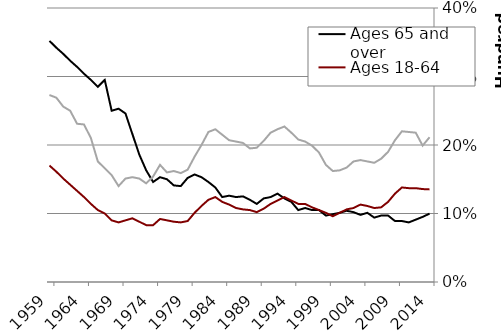
| Category | Ages 65 and over | Ages 18-64 |
|---|---|---|
| 2014.0 | 9.98 | 13.52 |
| 2013.0 | 9.506 | 13.565 |
| 2012.0 | 9.1 | 13.7 |
| 2011.0 | 8.7 | 13.7 |
| 2010.0 | 8.9 | 13.8 |
| 2009.0 | 8.9 | 12.9 |
| 2008.0 | 9.7 | 11.7 |
| 2007.0 | 9.7 | 10.9 |
| 2006.0 | 9.4 | 10.8 |
| 2005.0 | 10.1 | 11.1 |
| 2004.0 | 9.8 | 11.3 |
| 2003.0 | 10.2 | 10.8 |
| 2002.0 | 10.4 | 10.6 |
| 2001.0 | 10.1 | 10.1 |
| 2000.0 | 9.9 | 9.6 |
| 1999.0 | 9.7 | 10.1 |
| 1998.0 | 10.5 | 10.5 |
| 1997.0 | 10.5 | 10.9 |
| 1996.0 | 10.8 | 11.4 |
| 1995.0 | 10.5 | 11.4 |
| 1994.0 | 11.7 | 11.9 |
| 1993.0 | 12.2 | 12.4 |
| 1992.0 | 12.9 | 11.9 |
| 1991.0 | 12.4 | 11.4 |
| 1990.0 | 12.2 | 10.7 |
| 1989.0 | 11.4 | 10.2 |
| 1988.0 | 12 | 10.5 |
| 1987.0 | 12.5 | 10.6 |
| 1986.0 | 12.4 | 10.8 |
| 1985.0 | 12.6 | 11.3 |
| 1984.0 | 12.4 | 11.7 |
| 1983.0 | 13.8 | 12.4 |
| 1982.0 | 14.6 | 12 |
| 1981.0 | 15.3 | 11.1 |
| 1980.0 | 15.7 | 10.1 |
| 1979.0 | 15.2 | 8.9 |
| 1978.0 | 14 | 8.7 |
| 1977.0 | 14.1 | 8.8 |
| 1976.0 | 15 | 9 |
| 1975.0 | 15.3 | 9.2 |
| 1974.0 | 14.6 | 8.3 |
| 1973.0 | 16.3 | 8.3 |
| 1972.0 | 18.6 | 8.8 |
| 1971.0 | 21.6 | 9.3 |
| 1970.0 | 24.6 | 9 |
| 1969.0 | 25.3 | 8.7 |
| 1968.0 | 25 | 9 |
| 1967.0 | 29.5 | 10 |
| 1966.0 | 28.5 | 10.5 |
| 1965.0 | 29.5 | 11.4 |
| 1964.0 | 30.4 | 12.4 |
| 1963.0 | 31.4 | 13.3 |
| 1962.0 | 32.3 | 14.2 |
| 1961.0 | 33.3 | 15.1 |
| 1960.0 | 34.2 | 16.1 |
| 1959.0 | 35.2 | 17 |